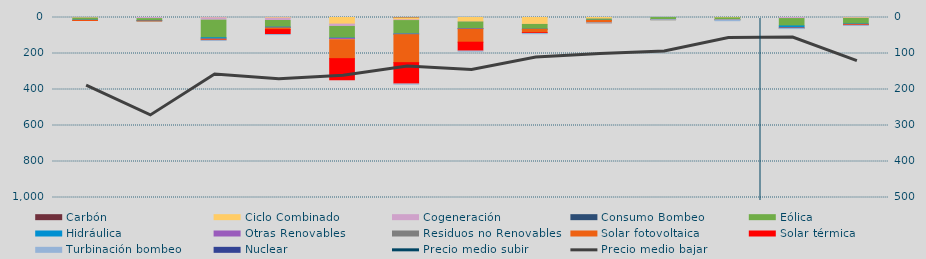
| Category | Carbón | Ciclo Combinado | Cogeneración | Consumo Bombeo | Eólica | Hidráulica | Otras Renovables | Residuos no Renovables | Solar fotovoltaica | Solar térmica | Turbinación bombeo | Nuclear |
|---|---|---|---|---|---|---|---|---|---|---|---|---|
| 0 | 0 | 582 | 2829.7 | 0 | 11683.6 | 231.6 | 1182.5 | 0 | 155.2 | 1067.3 | 0 | 0 |
| 1 | 0 | 0 | 6237.3 | 0 | 10203.7 | 1917.8 | 944.6 | 0 | 48.1 | 0 | 0 | 0 |
| 2 | 0 | 1230 | 13598.7 | 0 | 97489.7 | 5402.7 | 1813.8 | 1013 | 3586.5 | 2430.1 | 317.4 | 0 |
| 3 | 0 | 3090.6 | 13474.7 | 0 | 37149 | 1123.6 | 3207.9 | 675 | 8550.9 | 27054.6 | 431 | 0 |
| 4 | 0 | 36734.9 | 12855.2 | 0 | 65071.5 | 1518 | 6583 | 675 | 105142.4 | 122842 | 0 | 0 |
| 5 | 2096 | 11203.8 | 3780.2 | 0 | 74938.3 | 359.9 | 3182.9 | 0 | 155352.2 | 119223.3 | 200 | 0 |
| 6 | 0 | 23416.9 | 1799.3 | 0 | 36710.1 | 169.9 | 2791.7 | 130.2 | 72190.6 | 49997.5 | 140 | 0 |
| 7 | 0 | 38168.9 | 488.4 | 0 | 26054.9 | 21.9 | 466.4 | 0 | 19329.3 | 4158.9 | 1184.2 | 0 |
| 8 | 0 | 7357.7 | 1214.8 | 0 | 7240.9 | 133.6 | 501.7 | 0 | 12900.5 | 0 | 280 | 0 |
| 9 | 0 | 0 | 195.2 | 0 | 11271.7 | 31.8 | 43.5 | 0 | 327.2 | 72.2 | 190.9 | 0 |
| 10 | 0 | 1594 | 466.5 | 0 | 10201.8 | 124.4 | 68.4 | 0 | 144.3 | 50.3 | 5089.6 | 0 |
| 11 | 0 | 0 | 5902.2 | 0 | 40924.6 | 10096 | 2210.8 | 541.2 | 397.2 | 861 | 700 | 0 |
| 12 | 0 | 2180.9 | 2937.8 | 0 | 30839.8 | 1899.6 | 565.6 | 0 | 1849.2 | 2802 | 1100 | 0 |